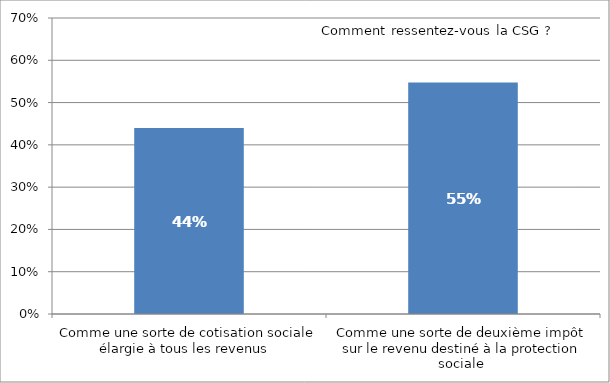
| Category |  Il existe des positions juridiques différentes en France et en Europe sur la CSG, la contribution sociale généralisée. De votre côté, comment ressentez-vous la CSG ?    |
|---|---|
| Comme une sorte de cotisation sociale élargie à tous les revenus   | 0.44 |
| Comme une sorte de deuxième impôt sur le revenu destiné à la protection sociale  | 0.548 |